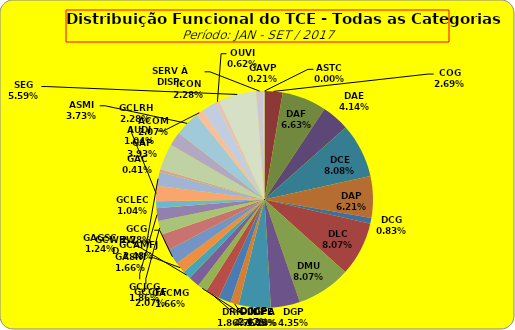
| Category | ASTC |
|---|---|
| ASTC | 0 |
| COG | 13 |
| DAF | 32 |
| DAE | 20 |
| DCE | 39 |
| DAP | 30 |
| DCG | 4 |
| DLC | 39 |
| DMU | 39 |
| DGP | 21 |
| DIN | 23 |
| DPE | 6 |
| DRR | 9 |
| DGCE | 10 |
| DGPA | 7 |
| GACMG | 8 |
| GAGSC | 6 |
| GASNI | 8 |
| GCG | 11 |
| GCAMFJ | 12 |
| GCCFF | 10 |
| GCJCG | 9 |
| GCLEC | 5 |
| GCLRH | 11 |
| GCWRWD | 10 |
| GAC | 2 |
| GAP | 19 |
| ACOM | 10 |
| ASMI | 18 |
| AUDI | 5 |
| ICON | 11 |
| OUVI | 3 |
| SEG | 27 |
| SERV À DISP. | 5 |
| GAVP | 1 |